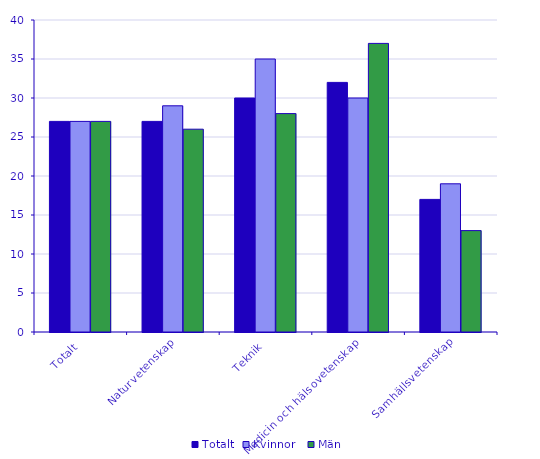
| Category | Totalt | Kvinnor  | Män |
|---|---|---|---|
| Totalt | 27 | 27 | 27 |
| Naturvetenskap | 27 | 29 | 26 |
| Teknik | 30 | 35 | 28 |
| Medicin och hälsovetenskap | 32 | 30 | 37 |
| Samhällsvetenskap | 17 | 19 | 13 |